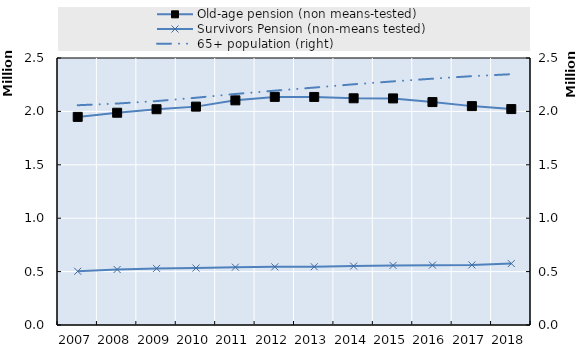
| Category | Old-age pension (non means-tested) | Survivors Pension (non-means tested) |
|---|---|---|
| 2007.0 | 1948444 | 503070 |
| 2008.0 | 1987520 | 519686 |
| 2009.0 | 2020403 | 529796 |
| 2010.0 | 2044729 | 533274 |
| 2011.0 | 2103412 | 541535 |
| 2012.0 | 2135789 | 544476 |
| 2013.0 | 2135396 | 545532 |
| 2014.0 | 2122833 | 551570 |
| 2015.0 | 2121579 | 557864 |
| 2016.0 | 2087415 | 560341 |
| 2017.0 | 2049432 | 562489 |
| 2018.0 | 2021744 | 575236 |